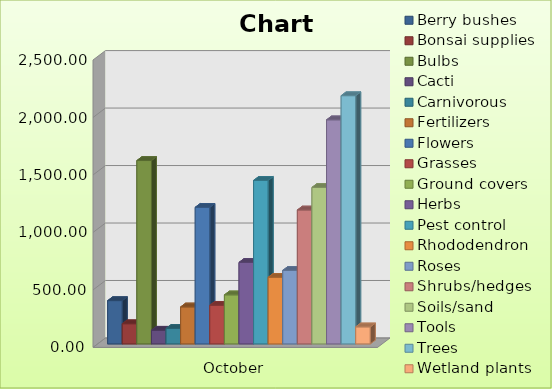
| Category | Berry bushes | Bonsai supplies | Bulbs | Cacti | Carnivorous | Fertilizers | Flowers | Grasses | Ground covers | Herbs | Pest control | Rhododendron | Roses | Shrubs/hedges | Soils/sand | Tools | Trees | Wetland plants |
|---|---|---|---|---|---|---|---|---|---|---|---|---|---|---|---|---|---|---|
| October | 376.5 | 175.4 | 1595.09 | 119 | 134.3 | 321.65 | 1188.25 | 335.9 | 426.55 | 709.05 | 1422.13 | 579.02 | 639.86 | 1164.9 | 1361.4 | 1949.22 | 2159.24 | 148 |